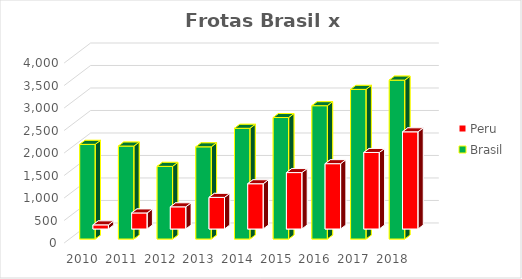
| Category | Peru | Brasil |
|---|---|---|
| 2010.0 | 92 | 2104 |
| 2011.0 | 357 | 2066 |
| 2012.0 | 493 | 1615 |
| 2013.0 | 703 | 2049 |
| 2014.0 | 1006 | 2461 |
| 2015.0 | 1254 | 2700 |
| 2016.0 | 1452 | 2963 |
| 2017.0 | 1701 | 3326 |
| 2018.0 | 2160 | 3532 |